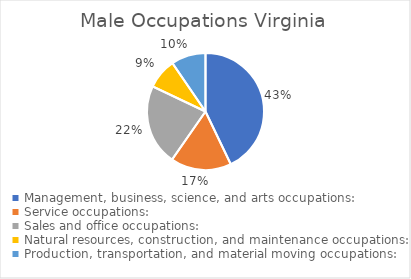
| Category | Series 0 | Series 1 |
|---|---|---|
| Management, business, science, and arts occupations: | 1731299 | 839679 |
| Service occupations: | 677558 | 289092 |
| Sales and office occupations: | 902731 | 334756 |
| Natural resources, construction, and maintenance occupations: | 339501 | 324805 |
| Production, transportation, and material moving occupations: | 385367 | 296962 |